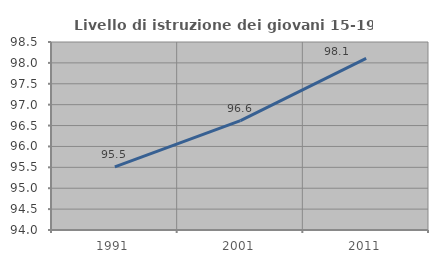
| Category | Livello di istruzione dei giovani 15-19 anni |
|---|---|
| 1991.0 | 95.513 |
| 2001.0 | 96.62 |
| 2011.0 | 98.106 |